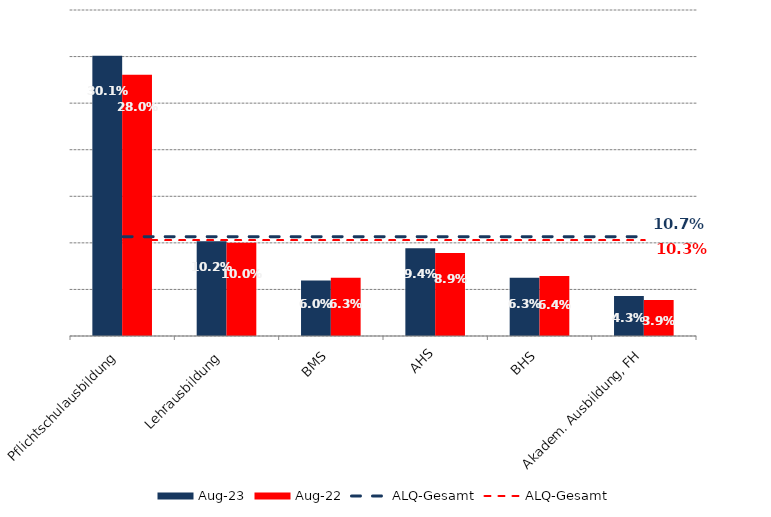
| Category | Aug 23 | Aug 22 |
|---|---|---|
| Pflichtschulausbildung | 0.301 | 0.28 |
| Lehrausbildung | 0.102 | 0.1 |
| BMS | 0.06 | 0.063 |
| AHS | 0.094 | 0.089 |
| BHS | 0.063 | 0.064 |
| Akadem. Ausbildung, FH | 0.043 | 0.039 |